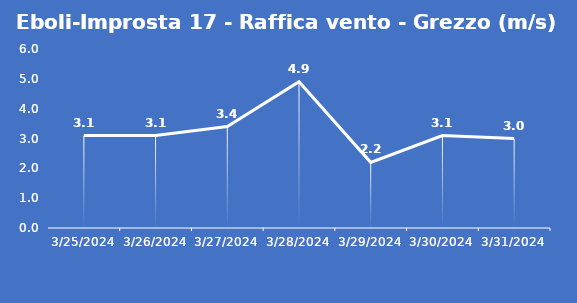
| Category | Eboli-Improsta 17 - Raffica vento - Grezzo (m/s) |
|---|---|
| 3/25/24 | 3.1 |
| 3/26/24 | 3.1 |
| 3/27/24 | 3.4 |
| 3/28/24 | 4.9 |
| 3/29/24 | 2.2 |
| 3/30/24 | 3.1 |
| 3/31/24 | 3 |